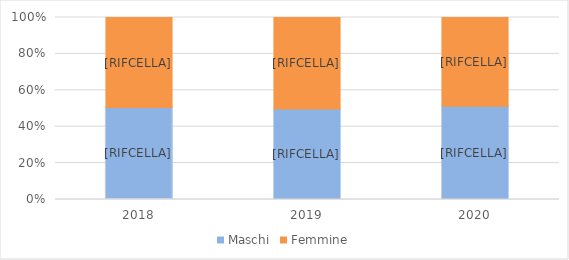
| Category | Maschi | Femmine |
|---|---|---|
| 2018.0 | 50.5 | 49.5 |
| 2019.0 | 49.7 | 50.3 |
| 2020.0 | 51.3 | 48.7 |